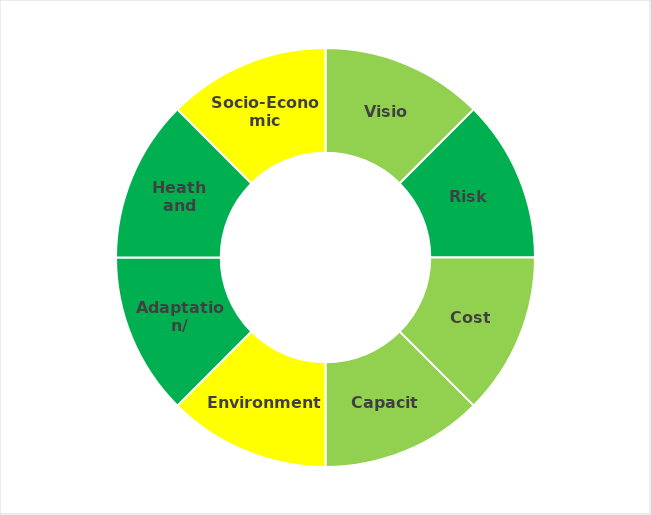
| Category | Ranking |
|---|---|
| Vision | 1 |
| Risk  | 1 |
| Cost | 1 |
| Capacity | 1 |
| Environmental | 1 |
| Adaptation/ Timeframe  | 1 |
| Heath and Population | 1 |
| Socio-Economic | 1 |